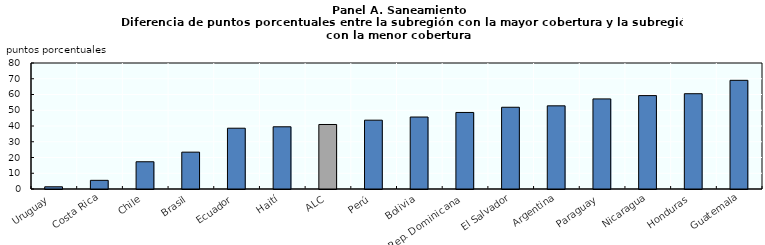
| Category | Series 0 |
|---|---|
| Uruguay | 1.4 |
| Costa Rica | 5.5 |
| Chile | 17.3 |
| Brasil | 23.4 |
| Ecuador | 38.6 |
| Haití | 39.5 |
| ALC | 40.96 |
| Perú | 43.7 |
| Bolivia | 45.7 |
| Rep. Dominicana | 48.6 |
| El Salvador | 51.9 |
| Argentina | 52.8 |
| Paraguay | 57.2 |
| Nicaragua | 59.3 |
| Honduras | 60.5 |
| Guatemala | 69 |